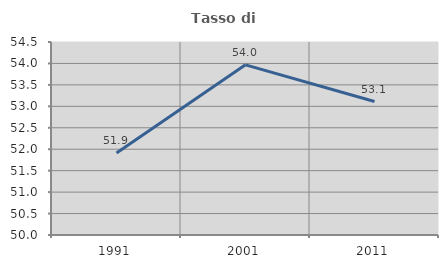
| Category | Tasso di occupazione   |
|---|---|
| 1991.0 | 51.91 |
| 2001.0 | 53.968 |
| 2011.0 | 53.112 |